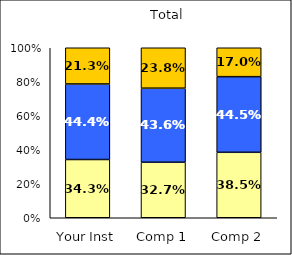
| Category | Low Institutional Priority: Civic Engagement | Average Institutional Priority: Civic Engagement | High Institutional Priority: Civic Engagement |
|---|---|---|---|
| Your Inst | 0.343 | 0.444 | 0.213 |
| Comp 1 | 0.327 | 0.436 | 0.238 |
| Comp 2 | 0.385 | 0.445 | 0.17 |